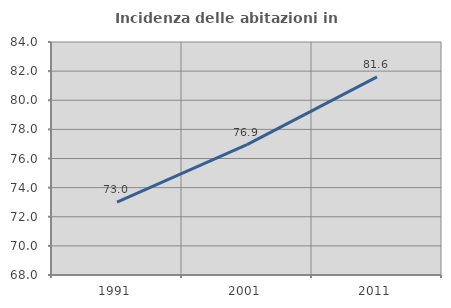
| Category | Incidenza delle abitazioni in proprietà  |
|---|---|
| 1991.0 | 73.011 |
| 2001.0 | 76.949 |
| 2011.0 | 81.601 |